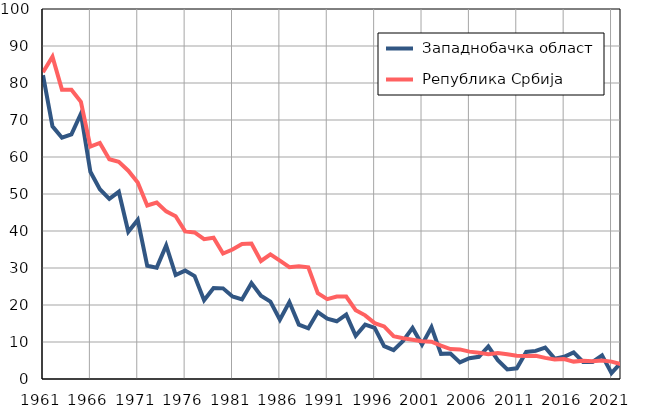
| Category |  Западнобачка област |  Република Србија |
|---|---|---|
| 1961.0 | 82.1 | 82.9 |
| 1962.0 | 68.3 | 87.1 |
| 1963.0 | 65.2 | 78.2 |
| 1964.0 | 66.1 | 78.2 |
| 1965.0 | 71.7 | 74.9 |
| 1966.0 | 56 | 62.8 |
| 1967.0 | 51.3 | 63.8 |
| 1968.0 | 48.7 | 59.4 |
| 1969.0 | 50.6 | 58.7 |
| 1970.0 | 39.8 | 56.3 |
| 1971.0 | 43 | 53.1 |
| 1972.0 | 30.6 | 46.9 |
| 1973.0 | 30.1 | 47.7 |
| 1974.0 | 36.1 | 45.3 |
| 1975.0 | 28.1 | 44 |
| 1976.0 | 29.3 | 39.9 |
| 1977.0 | 27.8 | 39.6 |
| 1978.0 | 21.3 | 37.8 |
| 1979.0 | 24.6 | 38.2 |
| 1980.0 | 24.5 | 33.9 |
| 1981.0 | 22.3 | 35 |
| 1982.0 | 21.5 | 36.5 |
| 1983.0 | 25.9 | 36.6 |
| 1984.0 | 22.5 | 31.9 |
| 1985.0 | 20.9 | 33.7 |
| 1986.0 | 16 | 32 |
| 1987.0 | 20.8 | 30.2 |
| 1988.0 | 14.7 | 30.5 |
| 1989.0 | 13.7 | 30.2 |
| 1990.0 | 18.1 | 23.2 |
| 1991.0 | 16.3 | 21.6 |
| 1992.0 | 15.6 | 22.3 |
| 1993.0 | 17.4 | 22.3 |
| 1994.0 | 11.7 | 18.6 |
| 1995.0 | 14.7 | 17.2 |
| 1996.0 | 13.8 | 15.1 |
| 1997.0 | 8.9 | 14.2 |
| 1998.0 | 7.8 | 11.6 |
| 1999.0 | 10.3 | 11 |
| 2000.0 | 13.8 | 10.6 |
| 2001.0 | 9.3 | 10.2 |
| 2002.0 | 14 | 10.1 |
| 2003.0 | 6.8 | 9 |
| 2004.0 | 6.9 | 8.1 |
| 2005.0 | 4.5 | 8 |
| 2006.0 | 5.6 | 7.4 |
| 2007.0 | 6 | 7.1 |
| 2008.0 | 8.8 | 6.7 |
| 2009.0 | 5.1 | 7 |
| 2010.0 | 2.6 | 6.7 |
| 2011.0 | 2.9 | 6.3 |
| 2012.0 | 7.3 | 6.2 |
| 2013.0 | 7.6 | 6.3 |
| 2014.0 | 8.5 | 5.7 |
| 2015.0 | 5.5 | 5.3 |
| 2016.0 | 6 | 5.4 |
| 2017.0 | 7.2 | 4.7 |
| 2018.0 | 4.6 | 4.9 |
| 2019.0 | 4.6 | 4.8 |
| 2020.0 | 6.4 | 5 |
| 2021.0 | 1.6 | 4.7 |
| 2022.0 | 4.4 | 4 |